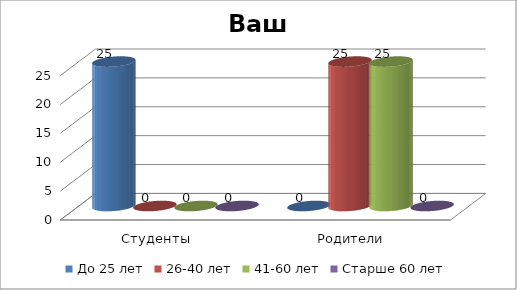
| Category | До 25 лет | 26-40 лет | 41-60 лет | Старше 60 лет |
|---|---|---|---|---|
| Студенты | 25 | 0 | 0 | 0 |
| Родители | 0 | 25 | 25 | 0 |